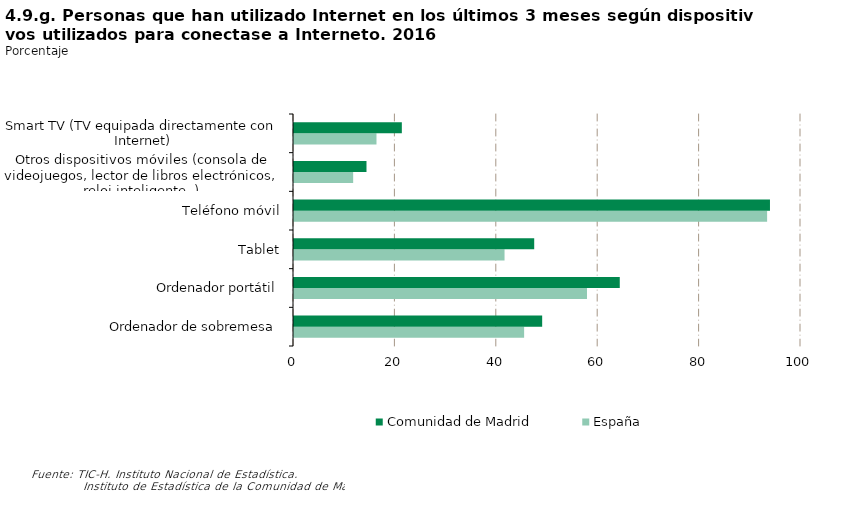
| Category | España | Comunidad de Madrid |
|---|---|---|
| Ordenador de sobremesa | 45.388 | 48.95 |
| Ordenador portátil | 57.79 | 64.255 |
| Tablet | 41.527 | 47.378 |
| Teléfono móvil | 93.315 | 93.88 |
| Otros dispositivos móviles (consola de videojuegos, lector de libros electrónicos, reloj inteligente,.) | 11.671 | 14.297 |
| Smart TV (TV equipada directamente con Internet) | 16.269 | 21.269 |